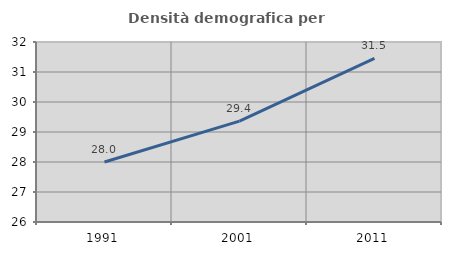
| Category | Densità demografica |
|---|---|
| 1991.0 | 28 |
| 2001.0 | 29.363 |
| 2011.0 | 31.454 |